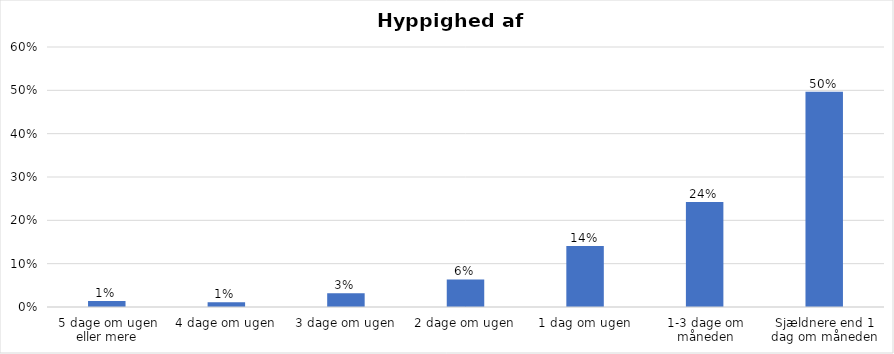
| Category | % |
|---|---|
| 5 dage om ugen eller mere | 0.014 |
| 4 dage om ugen | 0.011 |
| 3 dage om ugen | 0.032 |
| 2 dage om ugen | 0.063 |
| 1 dag om ugen | 0.141 |
| 1-3 dage om måneden | 0.242 |
| Sjældnere end 1 dag om måneden | 0.497 |